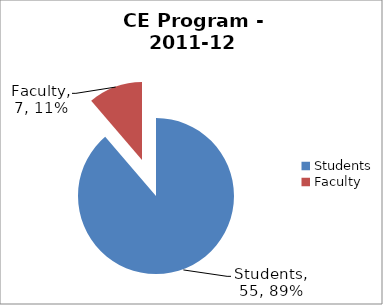
| Category | Series 0 |
|---|---|
| Students | 55 |
| Faculty | 7 |